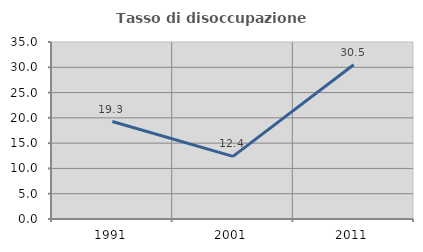
| Category | Tasso di disoccupazione giovanile  |
|---|---|
| 1991.0 | 19.268 |
| 2001.0 | 12.381 |
| 2011.0 | 30.508 |